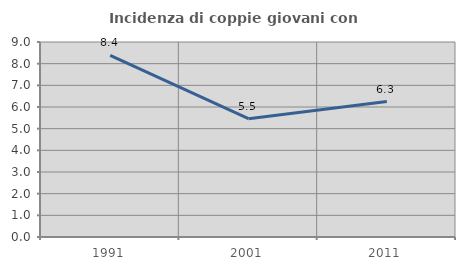
| Category | Incidenza di coppie giovani con figli |
|---|---|
| 1991.0 | 8.387 |
| 2001.0 | 5.461 |
| 2011.0 | 6.25 |